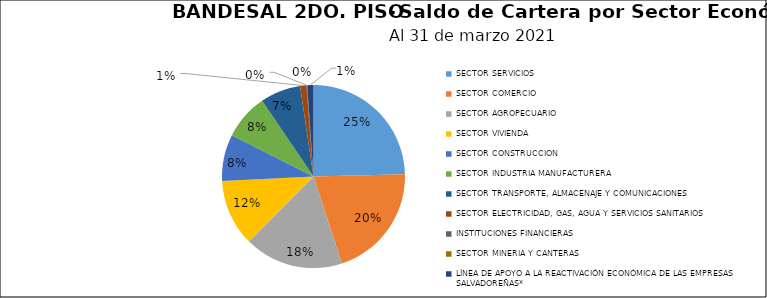
| Category | Saldo | Créditos |
|---|---|---|
| SECTOR SERVICIOS | 77.756 | 2965 |
| SECTOR COMERCIO | 64.302 | 4406 |
| SECTOR AGROPECUARIO | 55.262 | 1698 |
| SECTOR VIVIENDA | 37.236 | 2262 |
| SECTOR CONSTRUCCION | 26.014 | 1693 |
| SECTOR INDUSTRIA MANUFACTURERA | 25.449 | 357 |
| SECTOR TRANSPORTE, ALMACENAJE Y COMUNICACIONES | 22.57 | 1231 |
| SECTOR ELECTRICIDAD, GAS, AGUA Y SERVICIOS SANITARIOS | 3.511 | 14 |
| INSTITUCIONES FINANCIERAS | 0.403 | 2 |
| SECTOR MINERIA Y CANTERAS | 0.031 | 4 |
| LÍNEA DE APOYO A LA REACTIVACIÓN ECONÓMICA DE LAS EMPRESAS SALVADOREÑAS* | 3.475 | 0 |